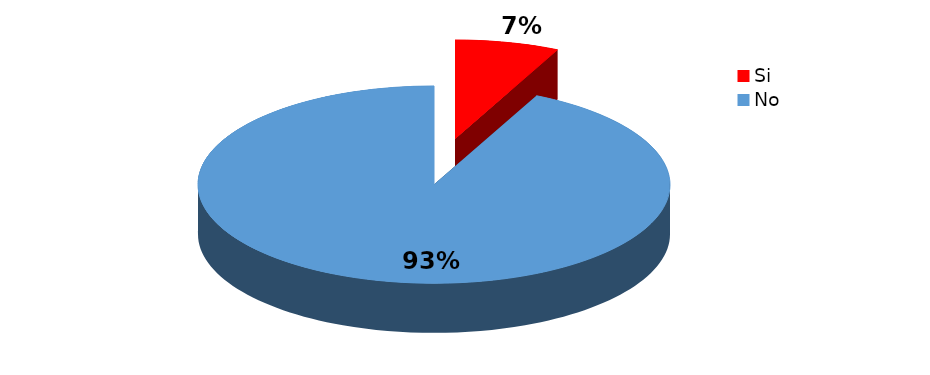
| Category | Series 0 |
|---|---|
| Si | 1 |
| No | 13 |